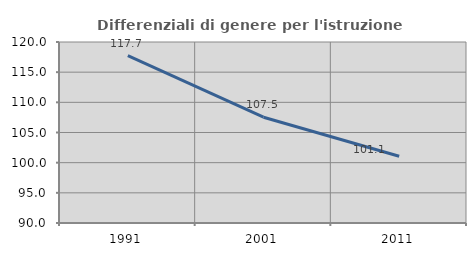
| Category | Differenziali di genere per l'istruzione superiore |
|---|---|
| 1991.0 | 117.744 |
| 2001.0 | 107.53 |
| 2011.0 | 101.054 |